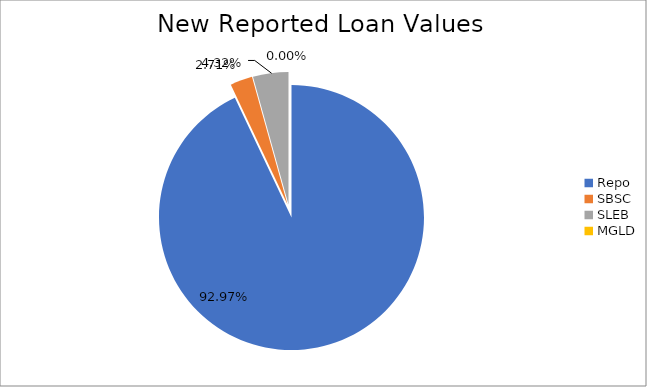
| Category | Series 0 |
|---|---|
| Repo | 9521596.535 |
| SBSC | 277756.597 |
| SLEB | 442458.034 |
| MGLD | 46.403 |